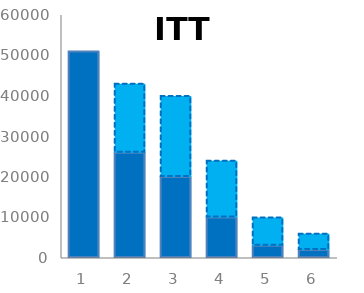
| Category | ITT | ITT imit |
|---|---|---|
| 0 | 51000 | 0 |
| 1 | 26000 | 17000 |
| 2 | 20000 | 20000 |
| 3 | 10000 | 14000 |
| 4 | 3000 | 7000 |
| 5 | 2000 | 4000 |